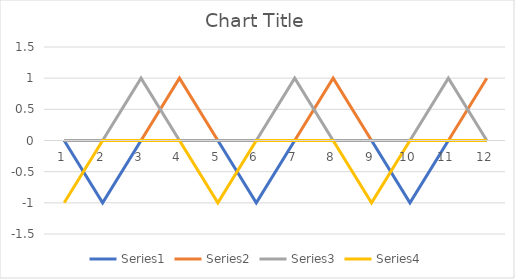
| Category | Series 0 | Series 1 | Series 2 | Series 3 |
|---|---|---|---|---|
| 0 | 0 | 0 | 0 | -1 |
| 1 | -1 | 0 | 0 | 0 |
| 2 | 0 | 0 | 1 | 0 |
| 3 | 0 | 1 | 0 | 0 |
| 4 | 0 | 0 | 0 | -1 |
| 5 | -1 | 0 | 0 | 0 |
| 6 | 0 | 0 | 1 | 0 |
| 7 | 0 | 1 | 0 | 0 |
| 8 | 0 | 0 | 0 | -1 |
| 9 | -1 | 0 | 0 | 0 |
| 10 | 0 | 0 | 1 | 0 |
| 11 | 0 | 1 | 0 | 0 |